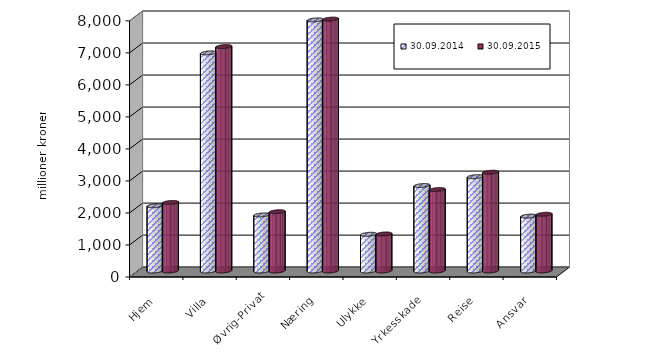
| Category | 30.09.2014 | 30.09.2015 |
|---|---|---|
| Hjem | 2037.962 | 2140.983 |
| Villa | 6812.412 | 7010.173 |
| Øvrig-Privat | 1751.084 | 1851.5 |
| Næring | 7842.913 | 7867.255 |
| Ulykke | 1146.948 | 1157.199 |
| Yrkesskade | 2669.25 | 2543.976 |
| Reise | 2947.959 | 3085.02 |
| Ansvar | 1715.605 | 1771.493 |